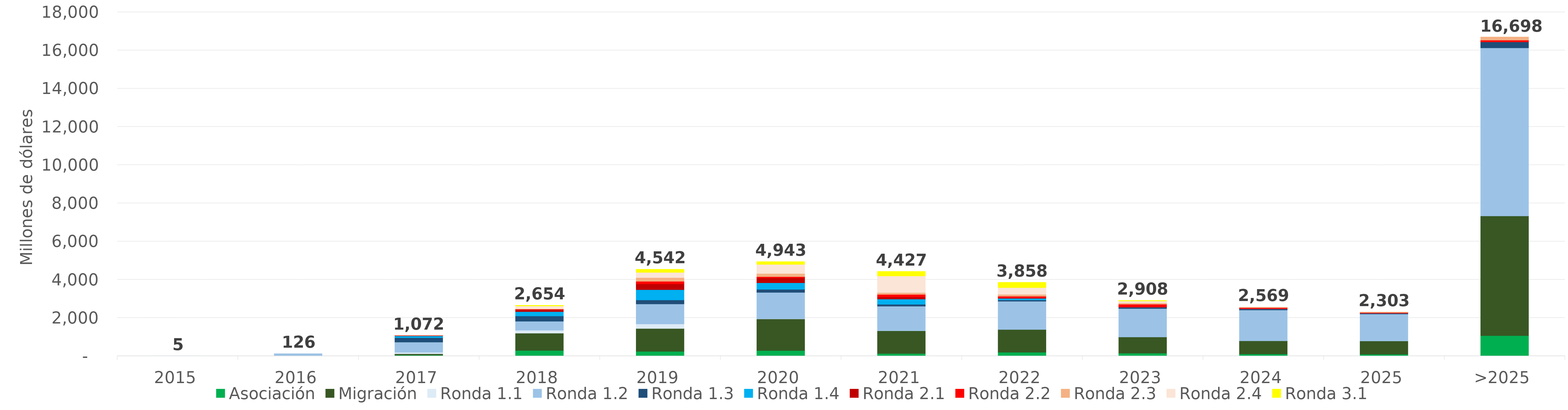
| Category | Asociación | Migración | Ronda 1.1 | Ronda 1.2 | Ronda 1.3 | Ronda 1.4 | Ronda 2.1 | Ronda 2.2 | Ronda 2.3 | Ronda 2.4 | Ronda 3.1 |
|---|---|---|---|---|---|---|---|---|---|---|---|
| 2015 | 0 | 0 | 4.573 | 0.236 | 0 | 0 | 0 | 0 | 0 | 0 | 0 |
| 2016 | 0 | 0 | 16.79 | 108.909 | 0 | 0 | 0 | 0 | 0 | 0 | 0 |
| 2017 | 50.877 | 65.422 | 76.429 | 533.486 | 231.789 | 93.443 | 18.851 | 1.29 | 0.72 | 0 | 0 |
| 2018 | 289.394 | 902.921 | 155.042 | 470.128 | 278.302 | 226.903 | 104.896 | 21.902 | 26.974 | 139.641 | 37.691 |
| 2019 | 241.207 | 1195.818 | 236.68 | 1049.68 | 207.126 | 540.649 | 302.09 | 133.009 | 199.161 | 270.262 | 166.186 |
| 2020 | 284.321 | 1655.641 | 6.736 | 1382.287 | 161.213 | 341.057 | 252.645 | 70.216 | 163.112 | 477.469 | 148.013 |
| 2021 | 127.797 | 1192.243 | 2.229 | 1284.713 | 97.796 | 274.593 | 106.762 | 133.184 | 98.223 | 870.647 | 238.989 |
| 2022 | 194.279 | 1192.976 | 0 | 1478.874 | 66.287 | 84.027 | 27.341 | 86.111 | 97.568 | 349.009 | 281.897 |
| 2023 | 149.166 | 842.772 | 0 | 1490.693 | 65.659 | 7.132 | 0.019 | 153.096 | 69.605 | 102.123 | 28.233 |
| 2024 | 102.681 | 691.937 | 0 | 1611.631 | 57.216 | 6.402 | 0 | 57.549 | 40.313 | 1.529 | 0 |
| 2025 | 89.748 | 692.667 | 0 | 1414.16 | 37.877 | 3.14 | 0 | 35.777 | 29.237 | 0 | 0 |
| >2025 | 1066.13 | 6262.668 | 0 | 8795.067 | 310.453 | 0 | 0 | 95.608 | 167.814 | 0 | 0 |